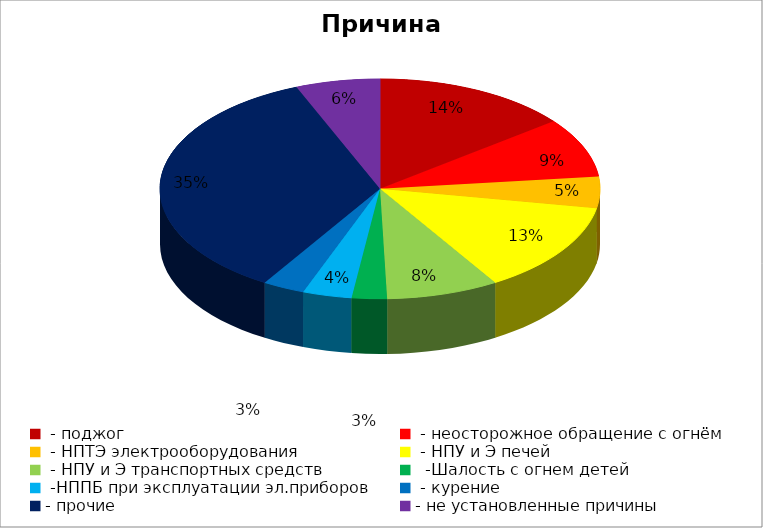
| Category | Причина пожара |
|---|---|
|  - поджог | 28 |
|  - неосторожное обращение с огнём | 17 |
|  - НПТЭ электрооборудования | 9 |
|  - НПУ и Э печей | 26 |
|  - НПУ и Э транспортных средств | 16 |
|   -Шалость с огнем детей | 5 |
|  -НППБ при эксплуатации эл.приборов | 7 |
|  - курение | 6 |
| - прочие | 68 |
| - не установленные причины | 12 |